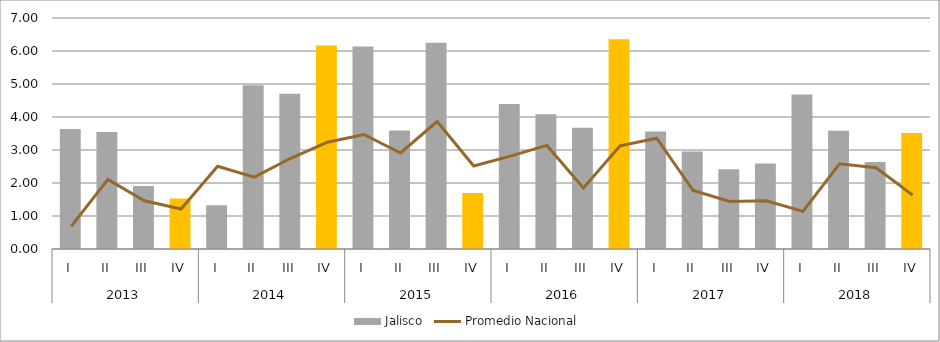
| Category | Jalisco |
|---|---|
| 0 | 3.635 |
| 1 | 3.543 |
| 2 | 1.908 |
| 3 | 1.527 |
| 4 | 1.329 |
| 5 | 4.96 |
| 6 | 4.705 |
| 7 | 6.167 |
| 8 | 6.14 |
| 9 | 3.59 |
| 10 | 6.254 |
| 11 | 1.695 |
| 12 | 4.397 |
| 13 | 4.084 |
| 14 | 3.673 |
| 15 | 6.353 |
| 16 | 3.564 |
| 17 | 2.955 |
| 18 | 2.413 |
| 19 | 2.59 |
| 20 | 4.68 |
| 21 | 3.583 |
| 22 | 2.638 |
| 23 | 3.516 |